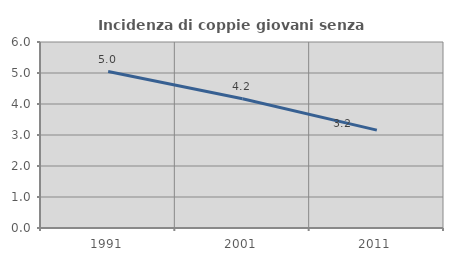
| Category | Incidenza di coppie giovani senza figli |
|---|---|
| 1991.0 | 5.047 |
| 2001.0 | 4.172 |
| 2011.0 | 3.157 |